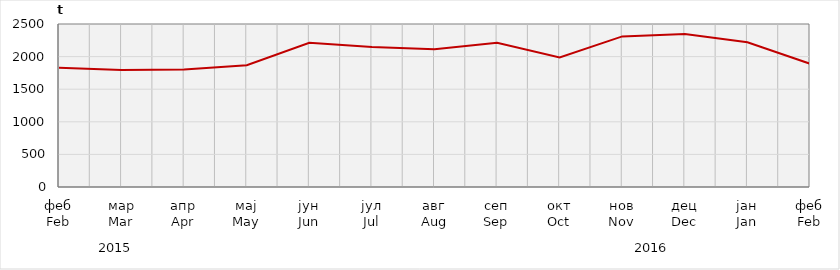
| Category | Нето тежина заклане стоке                              Net weight of  slaughtered livestock |
|---|---|
| феб
Feb | 1828587.85 |
| мар
Mar | 1792740.7 |
| апр
Apr | 1800600 |
| мај
May | 1866665 |
| јун
Jun | 2210576.92 |
| јул
Jul | 2148617 |
| авг
Aug | 2114109.78 |
| сеп
Sep | 2211725.58 |
| окт
Oct | 1985741.43 |
| нов
Nov | 2309850.52 |
| дец
Dec | 2344927.28 |
| јан
Jan | 2220030.9 |
| феб
Feb | 1890056.65 |